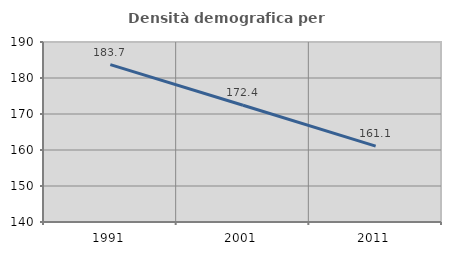
| Category | Densità demografica |
|---|---|
| 1991.0 | 183.698 |
| 2001.0 | 172.445 |
| 2011.0 | 161.059 |